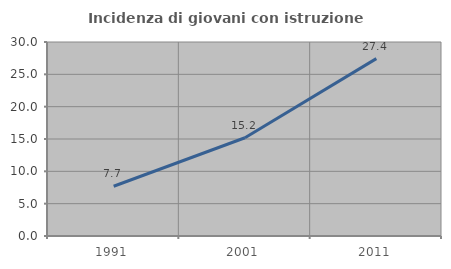
| Category | Incidenza di giovani con istruzione universitaria |
|---|---|
| 1991.0 | 7.692 |
| 2001.0 | 15.196 |
| 2011.0 | 27.434 |